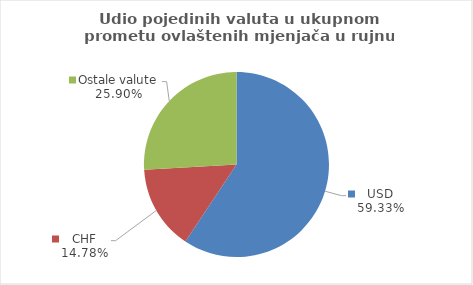
| Category | Series 0 |
|---|---|
| USD | 59.324 |
| CHF | 14.775 |
| Ostale valute | 25.901 |